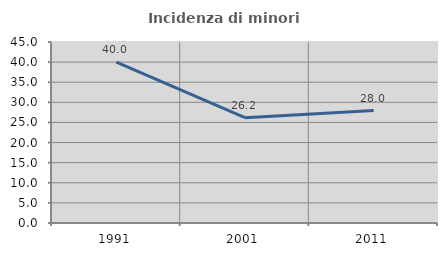
| Category | Incidenza di minori stranieri |
|---|---|
| 1991.0 | 40 |
| 2001.0 | 26.19 |
| 2011.0 | 27.966 |